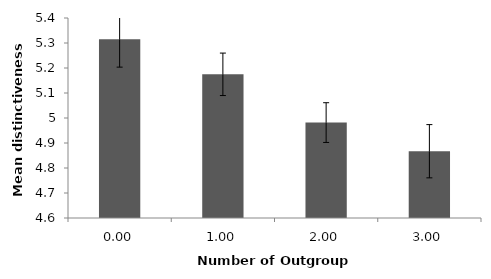
| Category | Number of Outgroup Features |
|---|---|
| 0.0 | 5.315 |
| 1.0 | 5.175 |
| 2.0 | 4.982 |
| 3.0 | 4.867 |